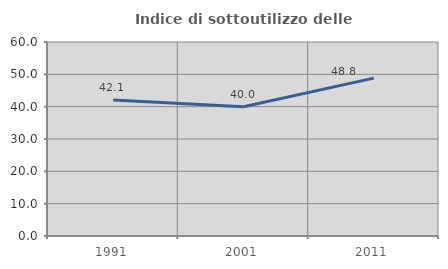
| Category | Indice di sottoutilizzo delle abitazioni  |
|---|---|
| 1991.0 | 42.056 |
| 2001.0 | 40 |
| 2011.0 | 48.819 |